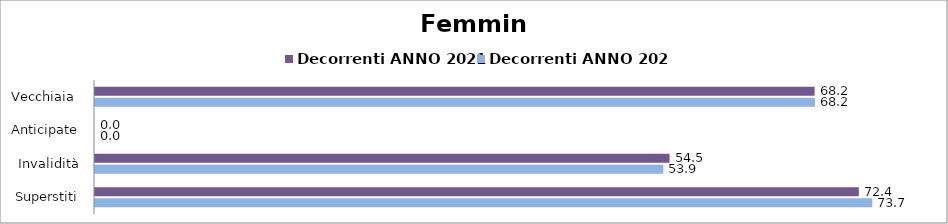
| Category | Decorrenti ANNO 2021 | Decorrenti ANNO 2022 |
|---|---|---|
| Vecchiaia  | 68.21 | 68.24 |
| Anticipate | 0 | 0 |
| Invalidità | 54.46 | 53.87 |
| Superstiti | 72.4 | 73.68 |